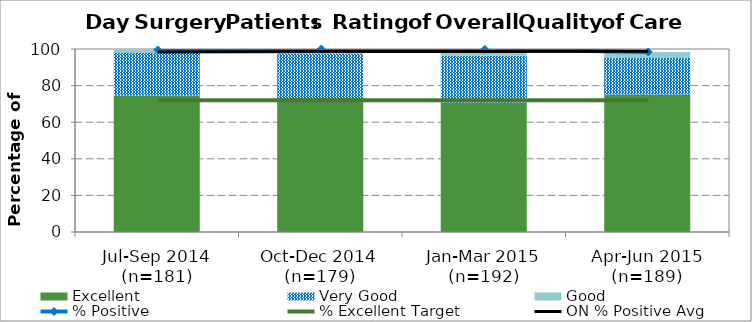
| Category | Excellent | Very Good | Good |
|---|---|---|---|
| Jul-Sep 2014 (n=181) | 74.59 | 23.2 | 1.66 |
| Oct-Dec 2014 (n=179) | 73.18 | 24.02 | 2.79 |
| Jan-Mar 2015 (n=192) | 70.83 | 25.52 | 2.6 |
| Apr-Jun 2015 (n=189) | 75.14 | 20 | 3.24 |